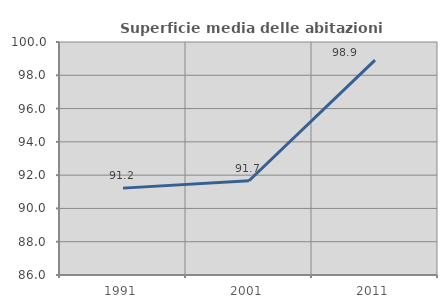
| Category | Superficie media delle abitazioni occupate |
|---|---|
| 1991.0 | 91.22 |
| 2001.0 | 91.665 |
| 2011.0 | 98.909 |